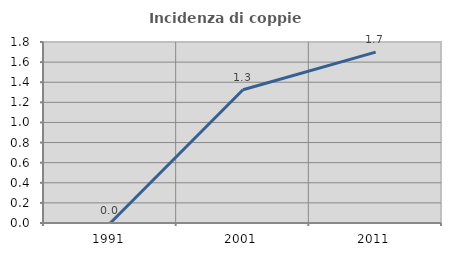
| Category | Incidenza di coppie miste |
|---|---|
| 1991.0 | 0 |
| 2001.0 | 1.325 |
| 2011.0 | 1.699 |